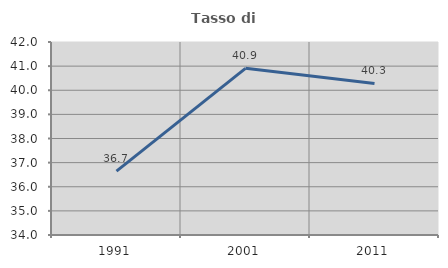
| Category | Tasso di occupazione   |
|---|---|
| 1991.0 | 36.65 |
| 2001.0 | 40.909 |
| 2011.0 | 40.284 |